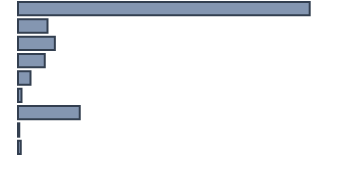
| Category | Percentatge |
|---|---|
| 0 | 92.6 |
| 1 | 9.4 |
| 2 | 11.7 |
| 3 | 8.5 |
| 4 | 4 |
| 5 | 1.1 |
| 6 | 19.6 |
| 7 | 0.4 |
| 8 | 0.9 |